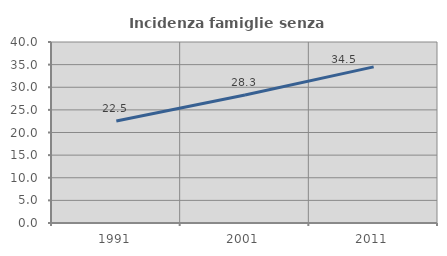
| Category | Incidenza famiglie senza nuclei |
|---|---|
| 1991.0 | 22.544 |
| 2001.0 | 28.285 |
| 2011.0 | 34.495 |